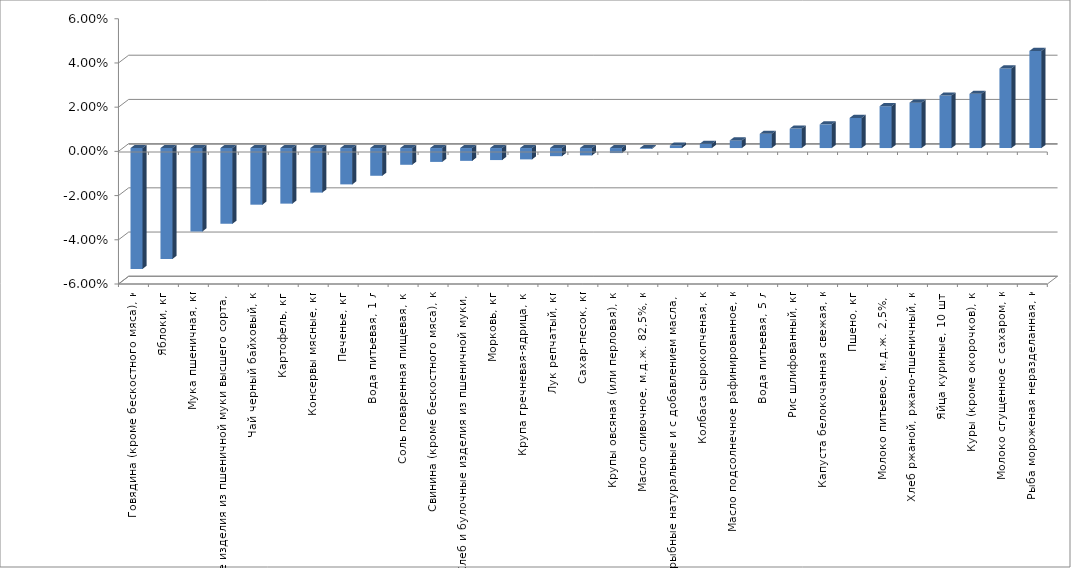
| Category | Series 0 |
|---|---|
| Говядина (кроме бескостного мяса), кг | -0.055 |
| Яблоки, кг | -0.05 |
| Мука пшеничная, кг | -0.038 |
| Макаронные изделия из пшеничной муки высшего сорта, кг | -0.034 |
| Чай черный байховый, кг | -0.026 |
| Картофель, кг | -0.025 |
| Консервы мясные, кг | -0.02 |
| Печенье, кг | -0.016 |
| Вода питьевая, 1 л | -0.013 |
| Соль поваренная пищевая, кг | -0.008 |
| Свинина (кроме бескостного мяса), кг | -0.006 |
| Хлеб и булочные изделия из пшеничной муки, кг | -0.006 |
| Морковь, кг | -0.005 |
| Крупа гречневая-ядрица, кг | -0.005 |
| Лук репчатый, кг | -0.004 |
| Сахар-песок, кг | -0.003 |
| Крупы овсяная (или перловая), кг | -0.002 |
| Масло сливочное, м.д.ж. 82,5%, кг | 0 |
| Консервы рыбные натуральные и с добавлением масла, кг | 0.001 |
| Колбаса сырокопченая, кг | 0.002 |
| Масло подсолнечное рафинированное, кг | 0.003 |
| Вода питьевая, 5 л | 0.006 |
| Рис шлифованный, кг | 0.009 |
| Капуста белокочанная свежая, кг | 0.011 |
| Пшено, кг | 0.014 |
| Молоко питьевое, м.д.ж. 2,5%, л | 0.019 |
| Хлеб ржаной, ржано-пшеничный, кг | 0.021 |
| Яйца куриные, 10 шт. | 0.024 |
| Куры (кроме окорочков), кг | 0.025 |
| Молоко сгущенное с сахаром, кг | 0.036 |
| Рыба мороженая неразделанная, кг | 0.044 |